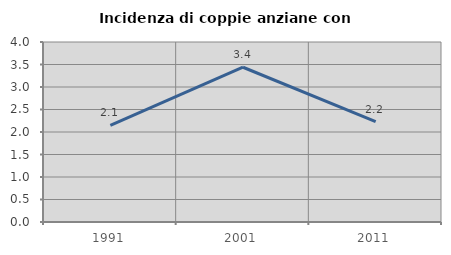
| Category | Incidenza di coppie anziane con figli |
|---|---|
| 1991.0 | 2.145 |
| 2001.0 | 3.439 |
| 2011.0 | 2.228 |